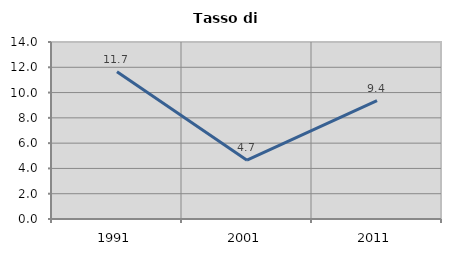
| Category | Tasso di disoccupazione   |
|---|---|
| 1991.0 | 11.653 |
| 2001.0 | 4.651 |
| 2011.0 | 9.357 |